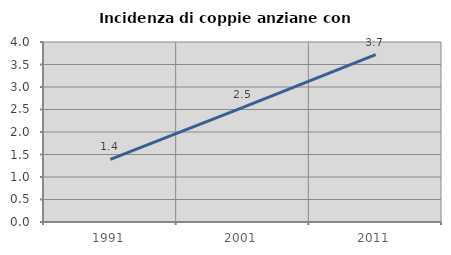
| Category | Incidenza di coppie anziane con figli |
|---|---|
| 1991.0 | 1.394 |
| 2001.0 | 2.545 |
| 2011.0 | 3.719 |